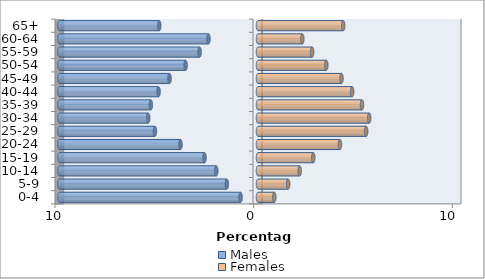
| Category | Males | Females |
|---|---|---|
| 0-4 | -0.877 | 0.821 |
| 5-9 | -1.569 | 1.518 |
| 10-14 | -2.1 | 2.098 |
| 15-19 | -2.692 | 2.783 |
| 20-24 | -3.902 | 4.124 |
| 25-29 | -5.189 | 5.446 |
| 30-34 | -5.528 | 5.598 |
| 35-39 | -5.395 | 5.236 |
| 40-44 | -5.005 | 4.739 |
| 45-49 | -4.452 | 4.202 |
| 50-54 | -3.643 | 3.437 |
| 55-59 | -2.938 | 2.724 |
| 60-64 | -2.493 | 2.231 |
| 65+ | -4.969 | 4.29 |